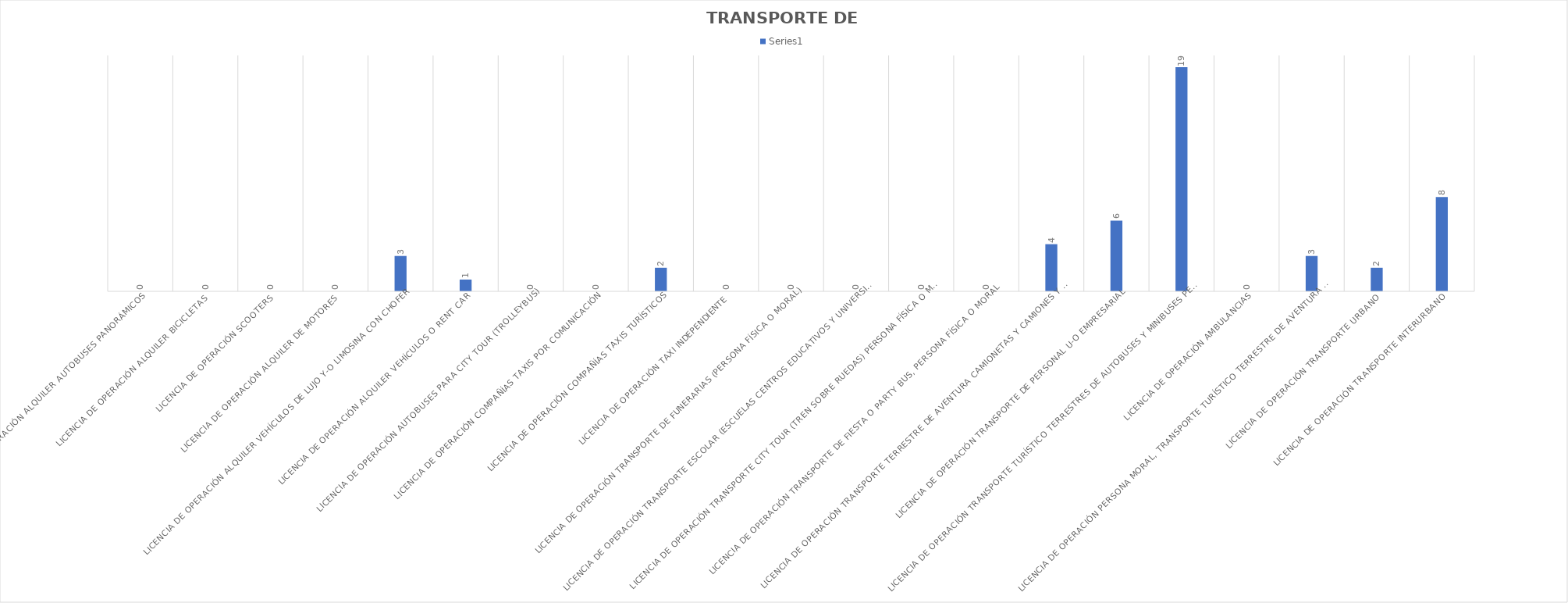
| Category | Series 0 |
|---|---|
| Licencia de Operación Alquiler Autobuses Panorámicos  | 0 |
| Licencia de Operación Alquiler Bicicletas  | 0 |
| Licencia de Operación Scooters | 0 |
| Licencia de Operación Alquiler de Motores  | 0 |
| Licencia de Operación Alquiler Vehículos de lujo y-o Limosina con chofer  | 3 |
| Licencia de Operación Alquiler Vehículos o Rent Car  | 1 |
| Licencia de Operación Autobuses para City Tour (TrolleyBus)  | 0 |
| Licencia de Operación Compañías Taxis por Comunicación  | 0 |
| Licencia de Operación Compañías Taxis Turísticos  | 2 |
| Licencia de Operación Taxi Independiente  | 0 |
| Licencia de Operación Transporte de Funerarias (Persona Física o Moral)  | 0 |
| Licencia de Operación Transporte Escolar (Escuelas Centros Educativos y Universidades)  | 0 |
| Licencia de Operación Transporte City Tour (Tren sobre Ruedas) Persona Física o Moral  | 0 |
| Licencia de Operación Transporte de Fiesta o Party Bus, Persona Física o Moral  | 0 |
| Licencia de Operación Transporte Terrestre de Aventura Camionetas y Camiones y o Jeep Safari Camiones  | 4 |
| Licencia de Operación Transporte de Personal u-o Empresarial  | 6 |
| Licencia de Operación Transporte Turístico Terrestres de Autobuses y Minibuses Persona Física o Moral  | 19 |
| Licencia de Operación Ambulancias | 0 |
| Licencia de Operación Persona Moral, Transporte Turístico Terrestre de Aventura (Four Wheel y Buggy)  | 3 |
| Licencia de Operación Transporte Urbano  | 2 |
| Licencia de Operación Transporte Interurbano  | 8 |